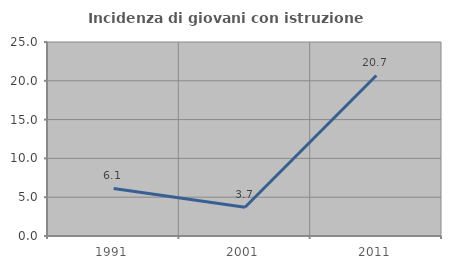
| Category | Incidenza di giovani con istruzione universitaria |
|---|---|
| 1991.0 | 6.122 |
| 2001.0 | 3.704 |
| 2011.0 | 20.69 |